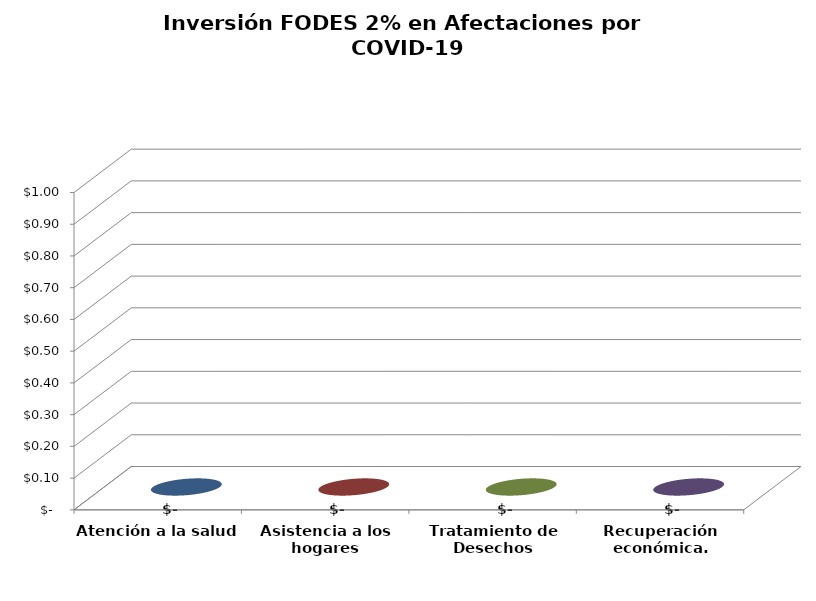
| Category | Series 0 |
|---|---|
| Atención a la salud | 0 |
| Asistencia a los hogares | 0 |
| Tratamiento de Desechos | 0 |
| Recuperación económica. | 0 |